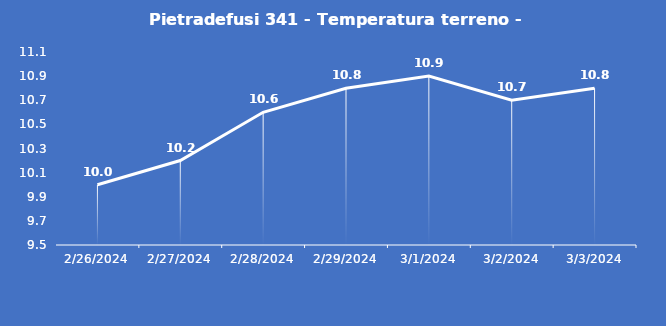
| Category | Pietradefusi 341 - Temperatura terreno - Grezzo (°C) |
|---|---|
| 2/26/24 | 10 |
| 2/27/24 | 10.2 |
| 2/28/24 | 10.6 |
| 2/29/24 | 10.8 |
| 3/1/24 | 10.9 |
| 3/2/24 | 10.7 |
| 3/3/24 | 10.8 |